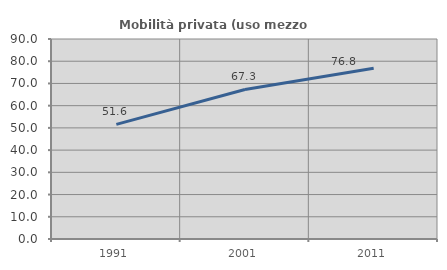
| Category | Mobilità privata (uso mezzo privato) |
|---|---|
| 1991.0 | 51.564 |
| 2001.0 | 67.285 |
| 2011.0 | 76.804 |